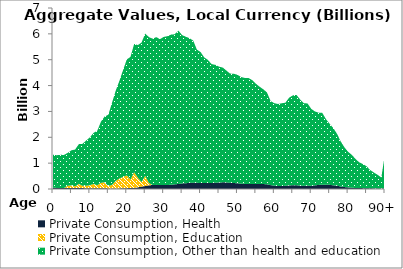
| Category | Private Consumption, Health | Private Consumption, Education | Private Consumption, Other than health and education |
|---|---|---|---|
| 0 | 45.751 | 0 | 1279.224 |
|  | 42.924 | 0 | 1264.012 |
| 2 | 41.257 | 0 | 1279.228 |
| 3 | 40.83 | 0 | 1277.909 |
| 4 | 36.696 | 91.441 | 1269.826 |
| 5 | 37.86 | 103.508 | 1354.92 |
| 6 | 36.965 | 65.366 | 1423.631 |
| 7 | 36.644 | 163.473 | 1535.04 |
| 8 | 34.191 | 86.772 | 1624.915 |
| 9 | 32.794 | 95.125 | 1749.305 |
| 10 | 31.971 | 114.118 | 1851.791 |
| 11 | 30.304 | 167.624 | 1972.947 |
| 12 | 29.505 | 114.296 | 2108.448 |
| 13 | 28.138 | 212.389 | 2363.768 |
| 14 | 26.493 | 235.551 | 2543.183 |
| 15 | 22.951 | 92.264 | 2756.742 |
| 16 | 22.011 | 135.371 | 3180.066 |
| 17 | 19.132 | 295.327 | 3485.87 |
| 18 | 23.25 | 384.927 | 3774.041 |
| 19 | 27.127 | 438.664 | 4134.79 |
| 20 | 32.969 | 495.607 | 4481.659 |
| 21 | 36.652 | 331.05 | 4742.123 |
| 22 | 42.088 | 608.972 | 4958.648 |
| 23 | 63.514 | 369.177 | 5133.634 |
| 24 | 91.38 | 176.943 | 5394.873 |
| 25 | 116.057 | 394.645 | 5502.986 |
| 26 | 141.605 | 89.226 | 5642.083 |
| 27 | 155.959 | 0 | 5658.714 |
| 28 | 159.63 | 0 | 5713.29 |
| 29 | 157.803 | 0 | 5637.695 |
| 30 | 155.72 | 0 | 5725.396 |
| 31 | 156.173 | 0 | 5753.674 |
| 32 | 162.68 | 0 | 5807.26 |
| 33 | 179.762 | 0 | 5805.502 |
| 34 | 194.47 | 0 | 5930.451 |
| 35 | 215.697 | 0 | 5736.429 |
| 36 | 222.939 | 0 | 5665.094 |
| 37 | 239.413 | 0 | 5592.742 |
| 38 | 242.395 | 0 | 5499.423 |
| 39 | 241.001 | 0 | 5150.081 |
| 40 | 229.85 | 0 | 5068.346 |
| 41 | 230.091 | 0 | 4859.741 |
| 42 | 236.396 | 0 | 4755.721 |
| 43 | 233.448 | 0 | 4596.406 |
| 44 | 242.939 | 0 | 4559.521 |
| 45 | 248.517 | 0 | 4482.72 |
| 46 | 257.618 | 0 | 4440.872 |
| 47 | 255.165 | 0 | 4325.348 |
| 48 | 240.023 | 0 | 4223.438 |
| 49 | 230.639 | 0 | 4226.466 |
| 50 | 221.482 | 0 | 4196.253 |
| 51 | 206.531 | 0 | 4123.436 |
| 52 | 197.073 | 0 | 4098.233 |
| 53 | 193.295 | 0 | 4098.838 |
| 54 | 194.97 | 0 | 4016.985 |
| 55 | 193.18 | 0 | 3878.661 |
| 56 | 194.045 | 0 | 3760.592 |
| 57 | 193.005 | 0 | 3664.832 |
| 58 | 178.666 | 0 | 3556.206 |
| 59 | 149.721 | 0 | 3251.131 |
| 60 | 128.648 | 0 | 3189.914 |
| 61 | 115.239 | 0 | 3172.386 |
| 62 | 117.082 | 0 | 3198.534 |
| 63 | 123.04 | 0 | 3214.81 |
| 64 | 134.196 | 0 | 3397.871 |
| 65 | 146.546 | 0 | 3473.097 |
| 66 | 144.845 | 0 | 3493.6 |
| 67 | 129.28 | 0 | 3331.06 |
| 68 | 119.648 | 0 | 3195.874 |
| 69 | 127.436 | 0 | 3182.12 |
| 70 | 119.597 | 0 | 2980.103 |
| 71 | 140.524 | 0 | 2859.261 |
| 72 | 157.114 | 0 | 2795.145 |
| 73 | 168.974 | 0 | 2774.916 |
| 74 | 167.091 | 0 | 2534.463 |
| 75 | 160.898 | 0 | 2361.01 |
| 76 | 141.369 | 0 | 2211.428 |
| 77 | 127.771 | 0 | 2003.325 |
| 78 | 97.088 | 0 | 1743.653 |
| 79 | 74.694 | 0 | 1536.629 |
| 80 | 61.084 | 0 | 1376.572 |
| 81 | 51.962 | 0 | 1270.123 |
| 82 | 38.387 | 0 | 1122.814 |
| 83 | 36.429 | 0 | 996.794 |
| 84 | 33.5 | 0 | 931.681 |
| 85 | 33.069 | 0 | 846.238 |
| 86 | 27.704 | 0 | 705.333 |
| 87 | 21.305 | 0 | 613.668 |
| 88 | 16.721 | 0 | 531.941 |
| 89 | 11.001 | 0 | 431.603 |
| 90+ | 25.664 | 0 | 1338.776 |